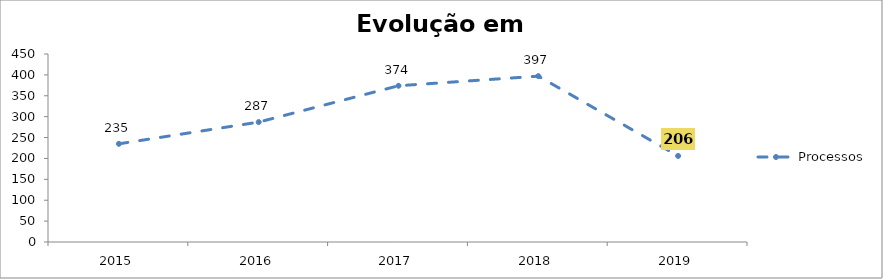
| Category | Processos |
|---|---|
| 2015.0 | 235 |
| 2016.0 | 287 |
| 2017.0 | 374 |
| 2018.0 | 397 |
| 2019.0 | 206 |